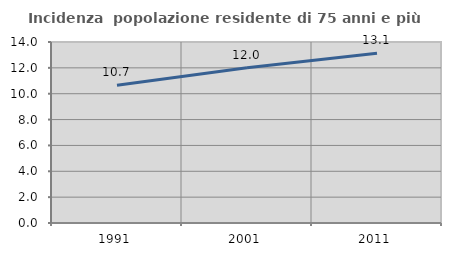
| Category | Incidenza  popolazione residente di 75 anni e più |
|---|---|
| 1991.0 | 10.654 |
| 2001.0 | 12.011 |
| 2011.0 | 13.131 |